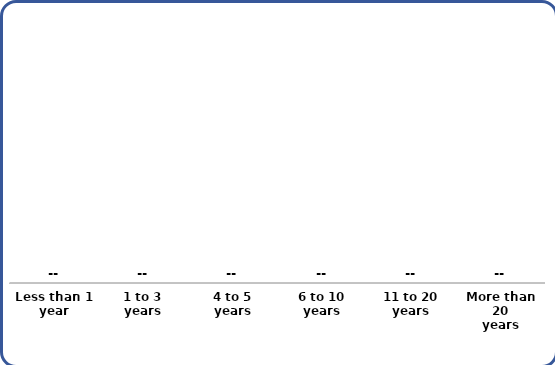
| Category | Series 0 |
|---|---|
| Less than 1
year | 0 |
| 1 to 3
years | 0 |
| 4 to 5
years | 0 |
| 6 to 10
years | 0 |
| 11 to 20
years | 0 |
| More than 20
years | 0 |